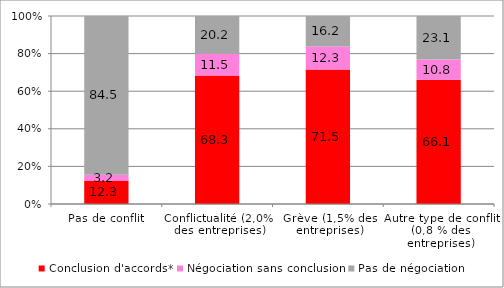
| Category | Conclusion d'accords* | Négociation sans conclusion | Pas de négociation |
|---|---|---|---|
| Pas de conflit | 12.3 | 3.2 | 84.5 |
| Conflictualité (2,0% des entreprises) | 68.3 | 11.5 | 20.2 |
| Grève (1,5% des entreprises) | 71.5 | 12.3 | 16.2 |
| Autre type de conflit (0,8 % des entreprises) | 66.1 | 10.8 | 23.1 |